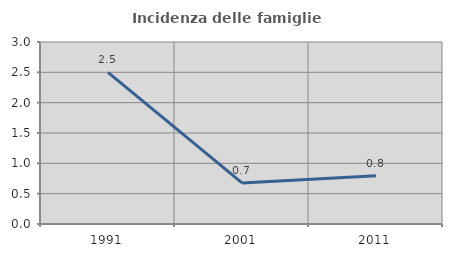
| Category | Incidenza delle famiglie numerose |
|---|---|
| 1991.0 | 2.5 |
| 2001.0 | 0.677 |
| 2011.0 | 0.797 |